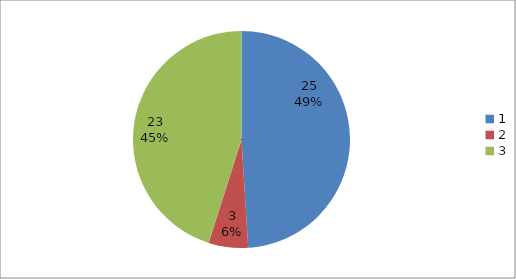
| Category | Series 0 |
|---|---|
| 0 | 25 |
| 1 | 3 |
| 2 | 23 |